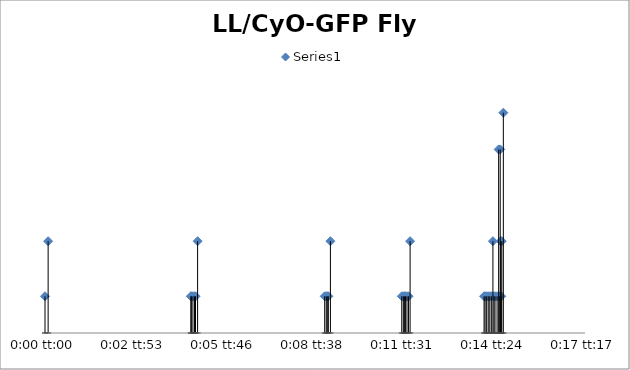
| Category | Series 0 |
|---|---|
| 0.0 | 2 |
| 6.944444444439979e-05 | 5 |
| 0.0032407407407407107 | 2 |
| 0.003252314814814805 | 2 |
| 0.0032870370370370328 | 2 |
| 0.0033217592592592604 | 2 |
| 0.0033449074074073937 | 2 |
| 0.00339120370370366 | 5 |
| 0.00621527777777775 | 2 |
| 0.006249999999999978 | 2 |
| 0.006273148148148111 | 2 |
| 0.006296296296296272 | 2 |
| 0.006342592592592566 | 5 |
| 0.007928240740740722 | 2 |
| 0.00796296296296295 | 2 |
| 0.007986111111111083 | 2 |
| 0.008009259259259244 | 2 |
| 0.008043981481481471 | 2 |
| 0.008078703703703671 | 2 |
| 0.008113425925925899 | 5 |
| 0.009756944444444415 | 2 |
| 0.009780092592592549 | 2 |
| 0.009814814814814776 | 2 |
| 0.009849537037037004 | 2 |
| 0.009884259259259232 | 2 |
| 0.00991898148148146 | 2 |
| 0.009953703703703659 | 5 |
| 0.00997685185185182 | 2 |
| 0.009999999999999953 | 2 |
| 0.010046296296296275 | 2 |
| 0.010081018518518503 | 10 |
| 0.010104166666666636 | 2 |
| 0.01011574074074073 | 10 |
| 0.010127314814814797 | 5 |
| 0.010138888888888864 | 2 |
| 0.010150462962962958 | 5 |
| 0.010185185185185186 | 12 |